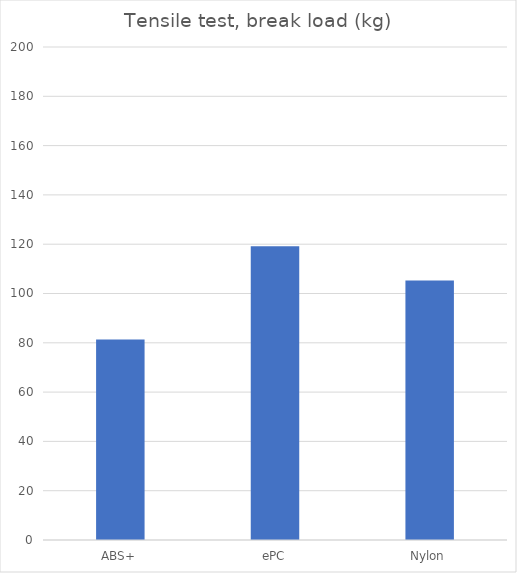
| Category | Average |
|---|---|
| ABS+ | 81.3 |
| ePC | 119.2 |
| Nylon | 105.3 |